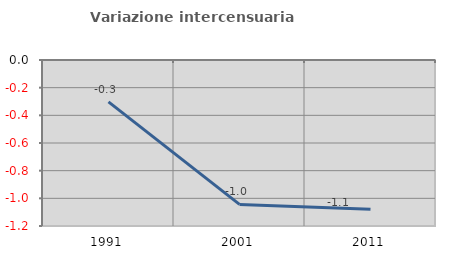
| Category | Variazione intercensuaria annua |
|---|---|
| 1991.0 | -0.303 |
| 2001.0 | -1.044 |
| 2011.0 | -1.078 |